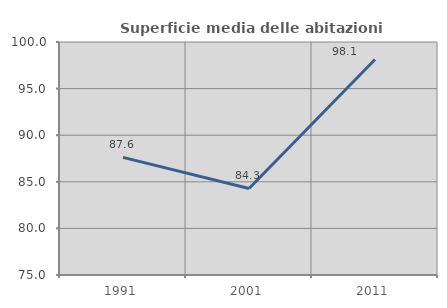
| Category | Superficie media delle abitazioni occupate |
|---|---|
| 1991.0 | 87.624 |
| 2001.0 | 84.288 |
| 2011.0 | 98.118 |